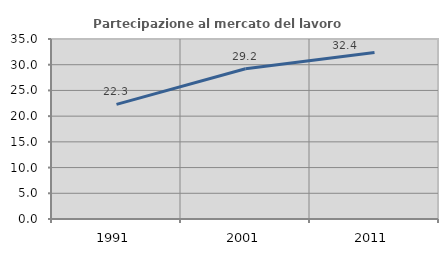
| Category | Partecipazione al mercato del lavoro  femminile |
|---|---|
| 1991.0 | 22.278 |
| 2001.0 | 29.216 |
| 2011.0 | 32.36 |